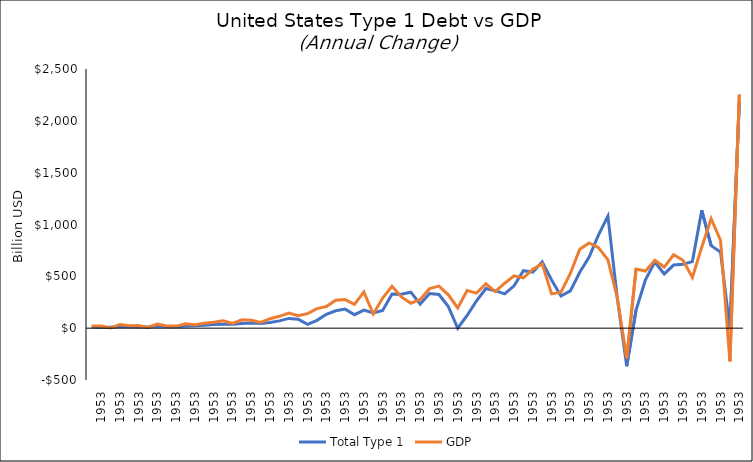
| Category | Total Type 1 | GDP |
|---|---|---|
| nan | 13.531 | 20.4 |
| 1953.0 | 9.615 | 21.9 |
| nan | 7.778 | 1.3 |
| 1953.0 | 19.425 | 35 |
| nan | 16.911 | 23.9 |
| 1953.0 | 13.979 | 24.6 |
| nan | 11.229 | 7.2 |
| 1953.0 | 20.791 | 40.5 |
| nan | 15.882 | 20.7 |
| 1953.0 | 14.652 | 19.8 |
| nan | 21.779 | 41.7 |
| 1953.0 | 24.234 | 33.6 |
| nan | 27.284 | 47 |
| 1953.0 | 35.761 | 57.8 |
| nan | 37.051 | 71.1 |
| 1953.0 | 36.909 | 46.6 |
| nan | 45.727 | 80.7 |
| 1953.0 | 49.716 | 76.9 |
| nan | 44.164 | 55.7 |
| 1953.0 | 54.129 | 91.6 |
| nan | 70.138 | 114.2 |
| 1953.0 | 94.035 | 146.3 |
| nan | 86.832 | 119.8 |
| 1953.0 | 36.064 | 139.7 |
| nan | 75.182 | 188.5 |
| 1953.0 | 133.234 | 208.4 |
| nan | 167.3 | 269.8 |
| 1953.0 | 183.72 | 275.7 |
| nan | 129.719 | 230 |
| 1953.0 | 174.477 | 349.7 |
| nan | 145.98 | 136.8 |
| 1953.0 | 171.445 | 290.2 |
| nan | 328.875 | 403.6 |
| 1953.0 | 328.236 | 301.4 |
| nan | 347.273 | 240.6 |
| 1953.0 | 231.99 | 275.6 |
| nan | 333.793 | 381.2 |
| 1953.0 | 324.6 | 405.2 |
| nan | 207.762 | 321.5 |
| 1953.0 | -0.619 | 195 |
| nan | 122.14 | 362.2 |
| 1953.0 | 262.632 | 338.3 |
| nan | 382.404 | 428.6 |
| 1953.0 | 361.409 | 352.5 |
| nan | 331.193 | 433.4 |
| 1953.0 | 408.633 | 504.5 |
| nan | 554.694 | 485.2 |
| 1953.0 | 540.452 | 568.4 |
| nan | 640.576 | 619.8 |
| 1953.0 | 464.118 | 330.9 |
| nan | 310.238 | 347.2 |
| 1953.0 | 360.233 | 527.4 |
| nan | 539.498 | 760.7 |
| 1953.0 | 686.509 | 822 |
| nan | 899.587 | 776.4 |
| 1953.0 | 1080.711 | 658.6 |
| nan | 289.842 | 295.7 |
| 1953.0 | -366.236 | -291.8 |
| nan | 174.597 | 570.9 |
| 1953.0 | 465.51 | 550.7 |
| nan | 637.917 | 654.3 |
| 1953.0 | 523.13 | 589.2 |
| nan | 608.633 | 707.5 |
| 1953.0 | 616.176 | 655.3 |
| nan | 641.896 | 489.1 |
| 1953.0 | 1136.07 | 782.2 |
| nan | 796.345 | 1055.8 |
| 1953.0 | 733.884 | 847.9 |
| nan | -8.503 | -320.5 |
| 1953.0 | 2181.628 | 2254.6 |